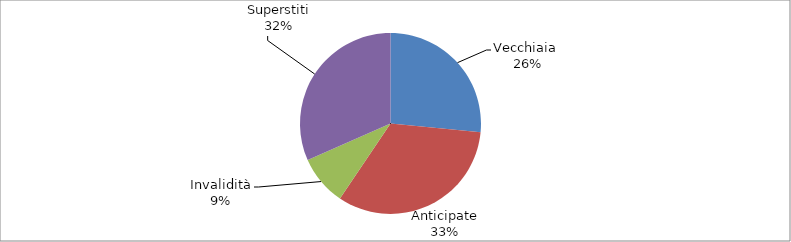
| Category | Series 0 |
|---|---|
| Vecchiaia  | 65750 |
| Anticipate | 81524 |
| Invalidità | 22222 |
| Superstiti | 78302 |